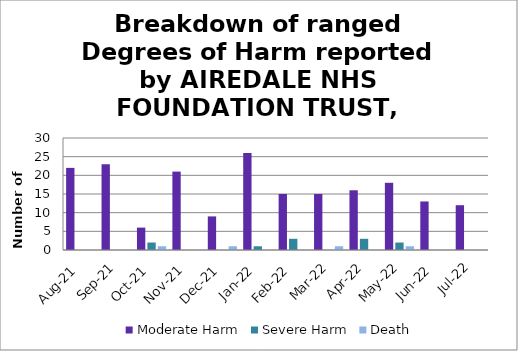
| Category | Moderate Harm | Severe Harm | Death |
|---|---|---|---|
| Aug-21 | 22 | 0 | 0 |
| Sep-21 | 23 | 0 | 0 |
| Oct-21 | 6 | 2 | 1 |
| Nov-21 | 21 | 0 | 0 |
| Dec-21 | 9 | 0 | 1 |
| Jan-22 | 26 | 1 | 0 |
| Feb-22 | 15 | 3 | 0 |
| Mar-22 | 15 | 0 | 1 |
| Apr-22 | 16 | 3 | 0 |
| May-22 | 18 | 2 | 1 |
| Jun-22 | 13 | 0 | 0 |
| Jul-22 | 12 | 0 | 0 |